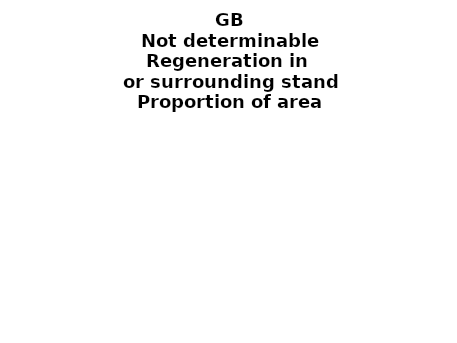
| Category | Not determinable |
|---|---|
| None | 0.003 |
| Seedlings only | 0 |
| Seedlings, saplings only | 0 |
| Seedlings, saplings, <7 cm trees | 0 |
| Saplings only | 0.001 |
| <7 cm trees, seedlings only | 0 |
| <7 cm trees, saplings only | 0.001 |
| <7 cm Trees only | 0.001 |